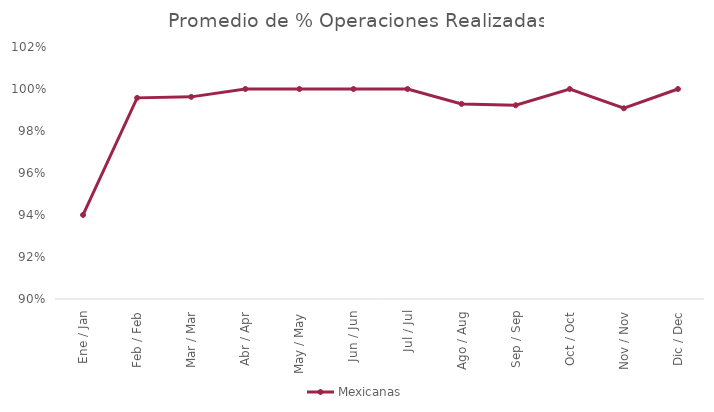
| Category | Mexicanas |
|---|---|
| Ene / Jan | 0.94 |
| Feb / Feb | 0.996 |
| Mar / Mar | 0.996 |
| Abr / Apr | 1 |
| May / May | 1 |
| Jun / Jun | 1 |
| Jul / Jul | 1 |
| Ago / Aug | 0.993 |
| Sep / Sep | 0.992 |
| Oct / Oct | 1 |
| Nov / Nov | 0.991 |
| Dic / Dec | 1 |